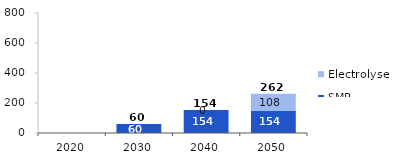
| Category | SMR | Electrolyser | Series 2 |
|---|---|---|---|
| 2020.0 | 0 | 0 | 0 |
| 2030.0 | 59.73 | 0 | 59.73 |
| 2040.0 | 154.082 | 0 | 154.082 |
| 2050.0 | 154.082 | 107.523 | 261.606 |